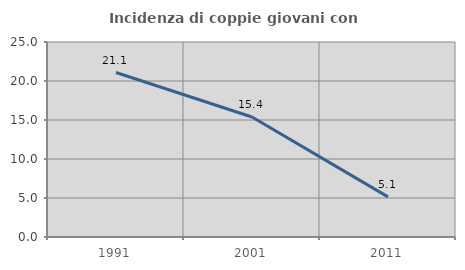
| Category | Incidenza di coppie giovani con figli |
|---|---|
| 1991.0 | 21.084 |
| 2001.0 | 15.385 |
| 2011.0 | 5.147 |